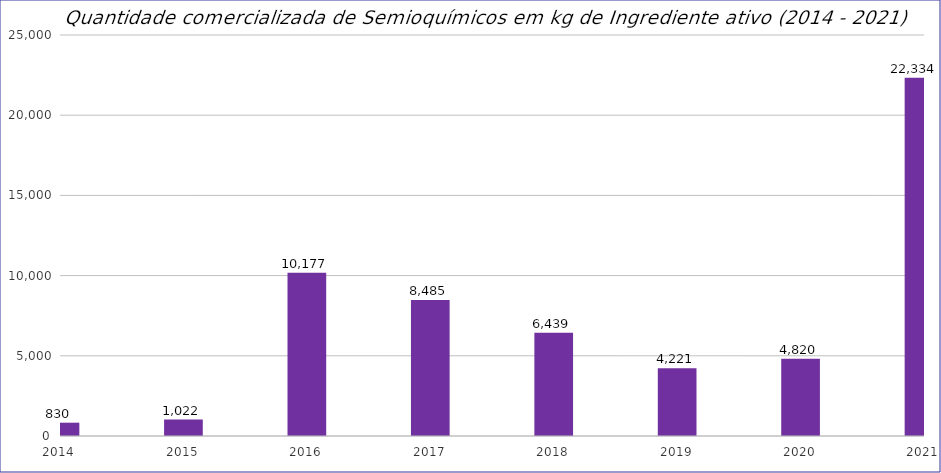
| Category | Vendas Internas |
|---|---|
| 2014.0 | 829.645 |
| 2015.0 | 1022.365 |
| 2016.0 | 10176.851 |
| 2017.0 | 8484.755 |
| 2018.0 | 6438.591 |
| 2019.0 | 4221.363 |
| 2020.0 | 4819.72 |
| 2021.0 | 22334.481 |